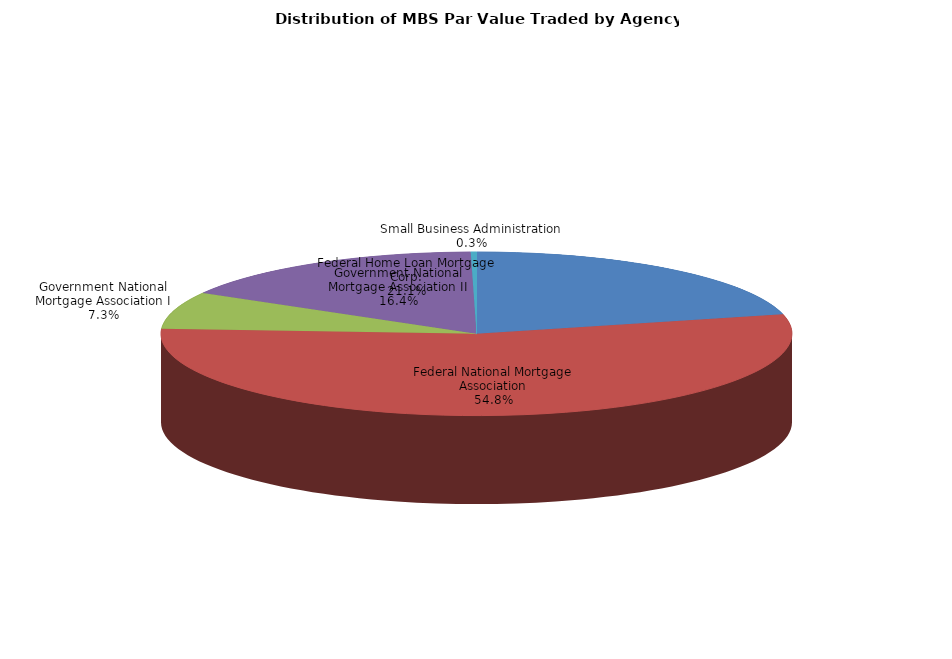
| Category | Series 0 |
|---|---|
| Federal Home Loan Mortgage Corp. | 3616067170.082 |
| Federal National Mortgage Association | 9375195255.561 |
| Government National Mortgage Association I | 1256459591.589 |
| Government National Mortgage Association II | 2799960412.118 |
| Small Business Administration | 50139301.766 |